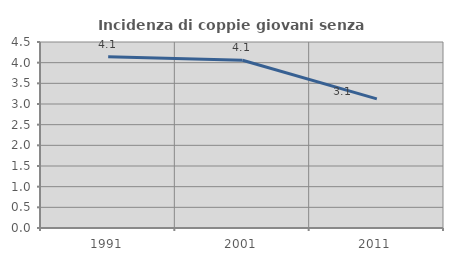
| Category | Incidenza di coppie giovani senza figli |
|---|---|
| 1991.0 | 4.144 |
| 2001.0 | 4.059 |
| 2011.0 | 3.123 |